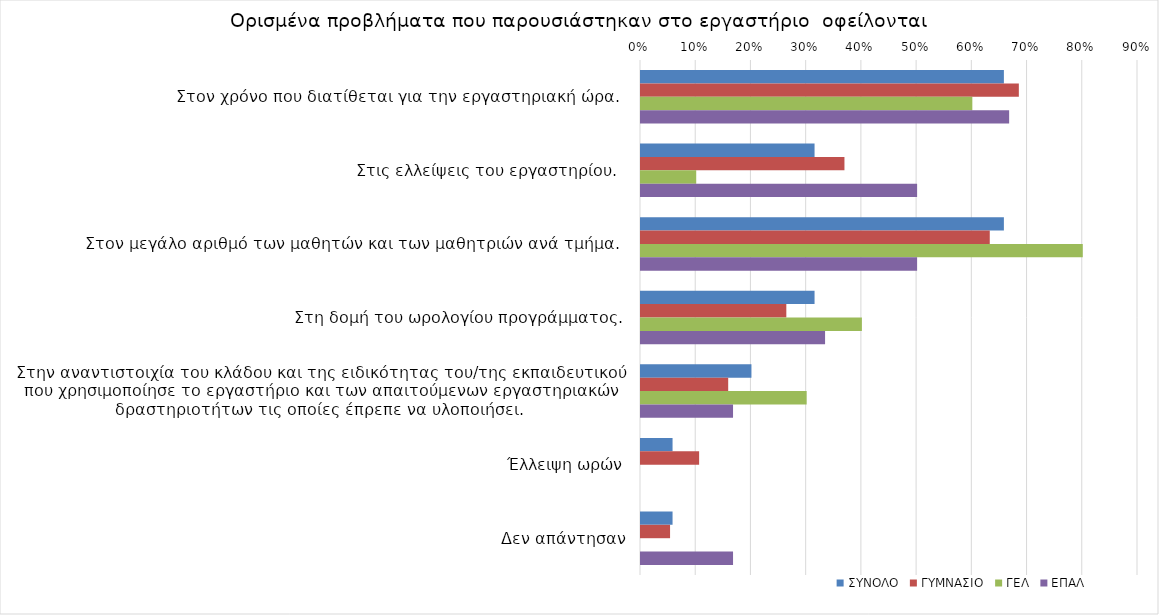
| Category | ΣΥΝΟΛΟ | ΓΥΜΝΑΣΙΟ | ΓΕΛ | ΕΠΑΛ |
|---|---|---|---|---|
| Στον χρόνο που διατίθεται για την εργαστηριακή ώρα.  | 0.657 | 0.684 | 0.6 | 0.667 |
| Στις ελλείψεις του εργαστηρίου.  | 0.314 | 0.368 | 0.1 | 0.5 |
| Στον μεγάλο αριθμό των μαθητών και των μαθητριών ανά τμήμα.  | 0.657 | 0.632 | 0.8 | 0.5 |
| Στη δομή του ωρολογίου προγράμματος. | 0.314 | 0.263 | 0.4 | 0.333 |
| Στην αναντιστοιχία του κλάδου και της ειδικότητας του/της εκπαιδευτικού που χρησιμοποίησε το εργαστήριο και των απαιτούμενων εργαστηριακών δραστηριοτήτων τις οποίες έπρεπε να υλοποιήσει.  | 0.2 | 0.158 | 0.3 | 0.167 |
| Έλλειψη ωρών | 0.057 | 0.105 | 0 | 0 |
| Δεν απάντησαν | 0.057 | 0.053 | 0 | 0.167 |